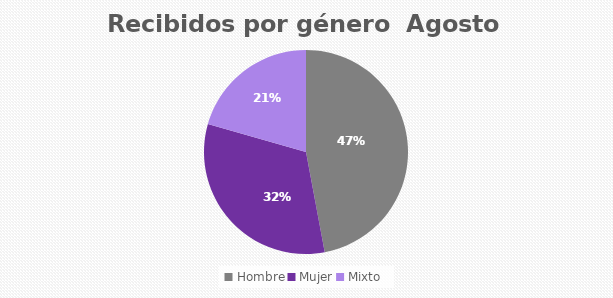
| Category | Recibidos por género  AGOSTO |
|---|---|
| Hombre | 16 |
| Mujer | 11 |
| Mixto | 7 |